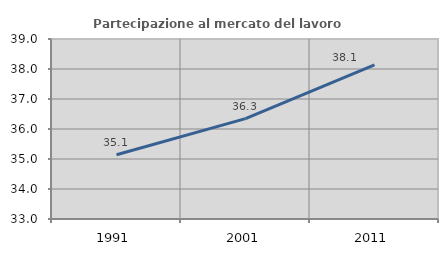
| Category | Partecipazione al mercato del lavoro  femminile |
|---|---|
| 1991.0 | 35.141 |
| 2001.0 | 36.346 |
| 2011.0 | 38.14 |